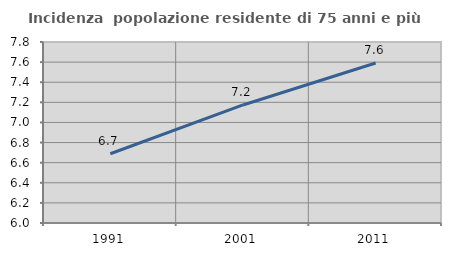
| Category | Incidenza  popolazione residente di 75 anni e più |
|---|---|
| 1991.0 | 6.689 |
| 2001.0 | 7.174 |
| 2011.0 | 7.591 |